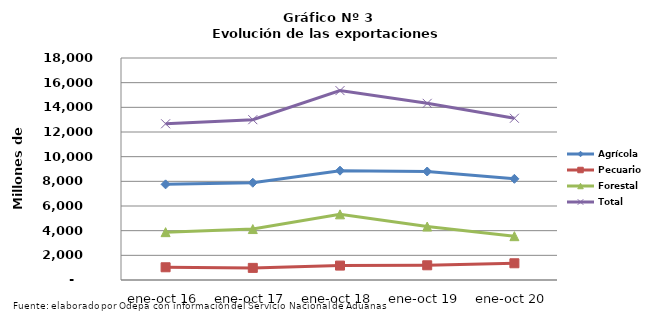
| Category | Agrícola | Pecuario | Forestal | Total |
|---|---|---|---|---|
| ene-oct 16 | 7755137 | 1032246 | 3879871 | 12667254 |
| ene-oct 17 | 7887220 | 981856 | 4130154 | 12999230 |
| ene-oct 18 | 8863890 | 1168335 | 5323915 | 15356140 |
| ene-oct 19 | 8796406 | 1192931 | 4334154 | 14323491 |
| ene-oct 20 | 8204101 | 1356110 | 3552961 | 13113172 |